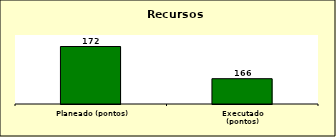
| Category | Series 0 |
|---|---|
| Planeado (pontos) | 172 |
| Executado (pontos) | 166.4 |